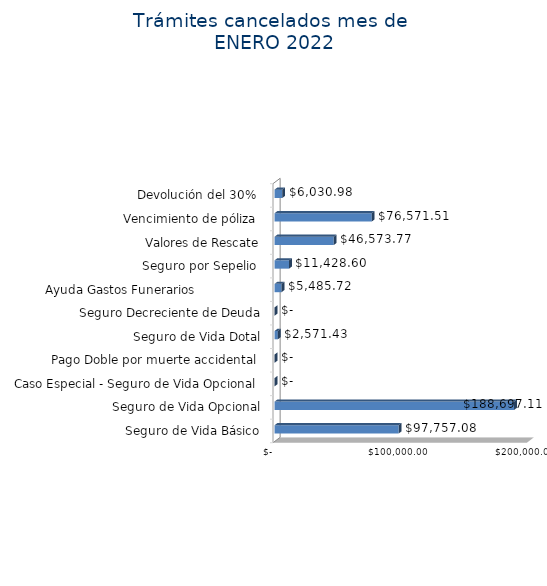
| Category | Monto  |
|---|---|
| Seguro de Vida Básico | 97757.08 |
| Seguro de Vida Opcional | 188697.11 |
| Caso Especial - Seguro de Vida Opcional  | 0 |
| Pago Doble por muerte accidental  | 0 |
| Seguro de Vida Dotal | 2571.43 |
| Seguro Decreciente de Deuda | 0 |
| Ayuda Gastos Funerarios                  | 5485.72 |
| Seguro por Sepelio  | 11428.6 |
| Valores de Rescate | 46573.77 |
| Vencimiento de póliza  | 76571.51 |
| Devolución del 30%  | 6030.98 |